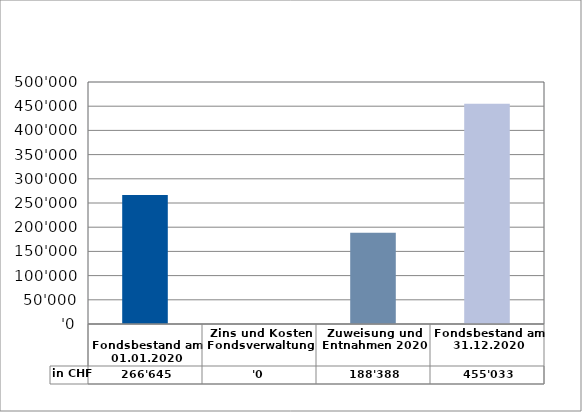
| Category | in CHF |
|---|---|
| 
Fondsbestand am 01.01.2020

 | 266645 |
| Zins und Kosten Fondsverwaltung | 0 |
| Zuweisung und Entnahmen 2020 | 188388.25 |
| Fondsbestand am 31.12.2020 | 455033.25 |